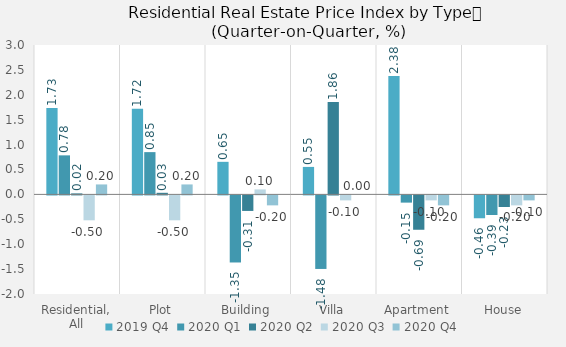
| Category | 2019 | 2020 |
|---|---|---|
| Residential, All | 1.734 | 0.2 |
| Plot | 1.72 | 0.2 |
| Building | 0.654 | -0.2 |
| Villa | 0.552 | 0 |
| Apartment | 2.376 | -0.2 |
| House | -0.459 | -0.1 |